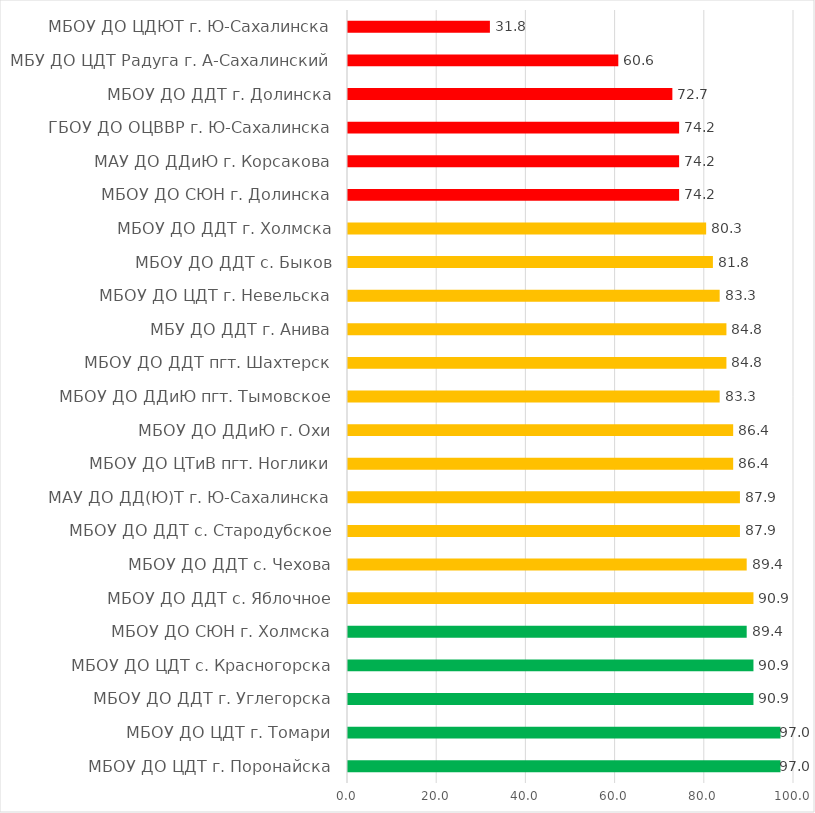
| Category | Series 0 |
|---|---|
| МБОУ ДО ЦДТ г. Поронайска | 96.97 |
| МБОУ ДО ЦДТ г. Томари | 96.97 |
| МБОУ ДО ДДТ г. Углегорска | 90.909 |
| МБОУ ДО ЦДТ с. Красногорска | 90.909 |
| МБОУ ДО СЮН г. Холмска | 89.394 |
| МБОУ ДО ДДТ с. Яблочное | 90.909 |
| МБОУ ДО ДДТ с. Чехова | 89.394 |
| МБОУ ДО ДДТ с. Стародубское | 87.879 |
| МАУ ДО ДД(Ю)Т г. Ю-Сахалинска | 87.879 |
| МБОУ ДО ЦТиВ пгт. Ноглики | 86.364 |
| МБОУ ДО ДДиЮ г. Охи | 86.364 |
| МБОУ ДО ДДиЮ пгт. Тымовское | 83.333 |
| МБОУ ДО ДДТ пгт. Шахтерск | 84.848 |
| МБУ ДО ДДТ г. Анива | 84.848 |
| МБОУ ДО ЦДТ г. Невельска | 83.333 |
| МБОУ ДО ДДТ с. Быков | 81.818 |
| МБОУ ДО ДДТ г. Холмска | 80.303 |
| МБОУ ДО СЮН г. Долинска | 74.242 |
| МАУ ДО ДДиЮ г. Корсакова | 74.242 |
| ГБОУ ДО ОЦВВР г. Ю-Сахалинска | 74.242 |
| МБОУ ДО ДДТ г. Долинска | 72.727 |
| МБУ ДО ЦДТ Радуга г. А-Сахалинский | 60.606 |
| МБОУ ДО ЦДЮТ г. Ю-Сахалинска | 31.818 |